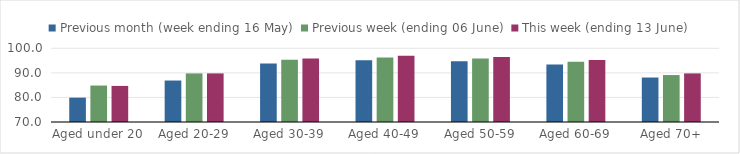
| Category | Previous month (week ending 16 May) | Previous week (ending 06 June) | This week (ending 13 June) |
|---|---|---|---|
| Aged under 20 | 79.91 | 84.838 | 84.689 |
| Aged 20-29 | 86.878 | 89.775 | 89.783 |
| Aged 30-39 | 93.83 | 95.374 | 95.833 |
| Aged 40-49 | 95.162 | 96.269 | 96.936 |
| Aged 50-59 | 94.714 | 95.865 | 96.496 |
| Aged 60-69 | 93.409 | 94.487 | 95.239 |
| Aged 70+ | 88.101 | 89.103 | 89.781 |